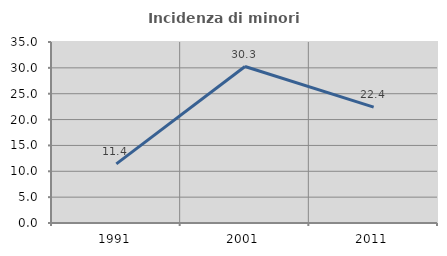
| Category | Incidenza di minori stranieri |
|---|---|
| 1991.0 | 11.429 |
| 2001.0 | 30.252 |
| 2011.0 | 22.394 |